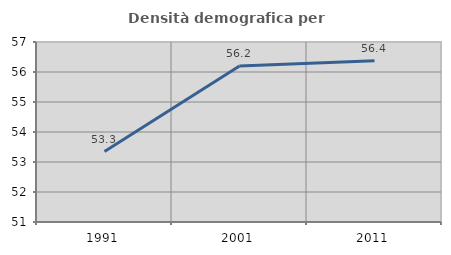
| Category | Densità demografica |
|---|---|
| 1991.0 | 53.349 |
| 2001.0 | 56.204 |
| 2011.0 | 56.371 |